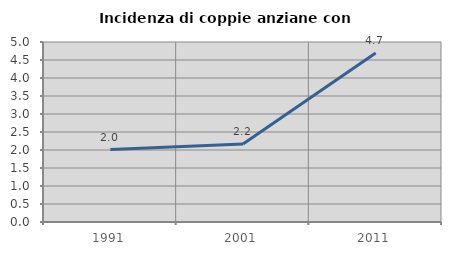
| Category | Incidenza di coppie anziane con figli |
|---|---|
| 1991.0 | 2.012 |
| 2001.0 | 2.165 |
| 2011.0 | 4.695 |